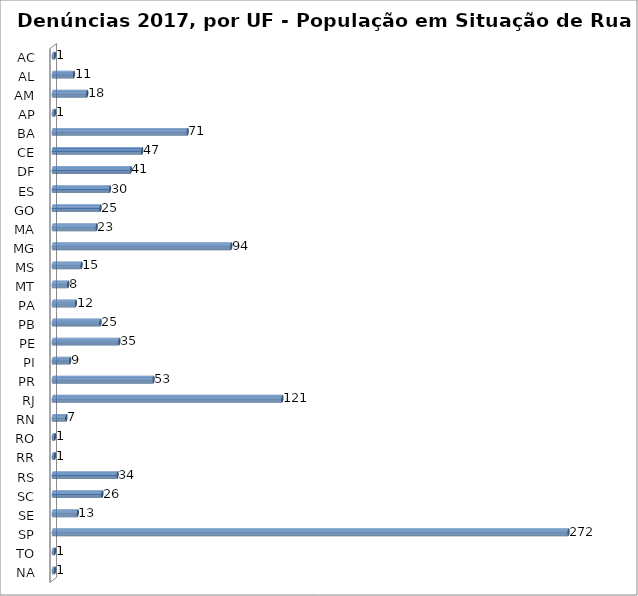
| Category | Series 0 |
|---|---|
| AC | 1 |
| AL | 11 |
| AM | 18 |
| AP | 1 |
| BA | 71 |
| CE | 47 |
| DF | 41 |
| ES | 30 |
| GO | 25 |
| MA | 23 |
| MG | 94 |
| MS | 15 |
| MT | 8 |
| PA | 12 |
| PB | 25 |
| PE | 35 |
| PI | 9 |
| PR | 53 |
| RJ | 121 |
| RN | 7 |
| RO | 1 |
| RR | 1 |
| RS | 34 |
| SC | 26 |
| SE | 13 |
| SP | 272 |
| TO | 1 |
| NA | 1 |